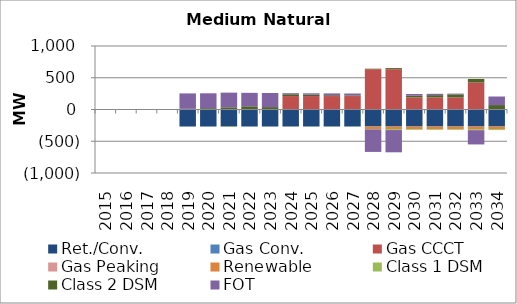
| Category | Ret./Conv. | Gas Conv. | Gas CCCT | Gas Peaking | Renewable | Class 1 DSM | Class 2 DSM | FOT |
|---|---|---|---|---|---|---|---|---|
| 2015.0 | 0 | 0 | 0 | 0 | 0 | 0 | 0.57 | -0.357 |
| 2016.0 | 0 | 0 | 0 | 0 | 0 | 0 | 2.31 | -1.661 |
| 2017.0 | 0 | 0 | 0 | 0 | 0 | 0 | 4.34 | -2.993 |
| 2018.0 | 0 | 0 | 0 | 0 | 0 | 0 | 6.76 | -4.708 |
| 2019.0 | -268 | 0 | 0 | 0 | 0 | 0 | 10.29 | 243.092 |
| 2020.0 | -268 | 0 | 0 | 0 | 0 | 0 | 21.27 | 233.893 |
| 2021.0 | -268 | 0 | 0 | 0 | 0 | -7.45 | 34.51 | 230.79 |
| 2022.0 | -268 | 0 | 0 | 0 | 0 | 3.17 | 47.6 | 211.491 |
| 2023.0 | -268 | 0 | 0 | 0 | 0 | -0.23 | 37.71 | 222.338 |
| 2024.0 | -268 | 0 | 212 | 0 | 0 | -3.96 | 27.93 | 17.081 |
| 2025.0 | -268 | 0 | 212 | 0 | 0 | -3.96 | 20.43 | 22.613 |
| 2026.0 | -268 | 0 | 212 | 0 | 0 | -4.03 | 12.79 | 28.562 |
| 2027.0 | -268 | 0 | 212 | 0 | 0 | -4.03 | 9.76 | 30.252 |
| 2028.0 | -268 | 0 | 635 | 0 | -41 | -4.03 | 7.68 | -354.907 |
| 2029.0 | -268 | 0 | 635 | 0 | -41 | -14.58 | 16.76 | -350.619 |
| 2030.0 | -268 | 0 | 189.783 | 0 | -41 | -11.18 | 26.59 | 27.958 |
| 2031.0 | -268 | 0 | 189.783 | 0 | -41 | -11.18 | 36.34 | 20.844 |
| 2032.0 | -268 | 0 | 189.783 | 0 | -41 | -11.18 | 49.08 | 11.457 |
| 2033.0 | -268 | 0 | 424 | 0 | -41 | -16.12 | 57.42 | -225.096 |
| 2034.0 | -268 | 0 | 1 | 0 | -41 | -14.77 | 68.94 | 134.701 |